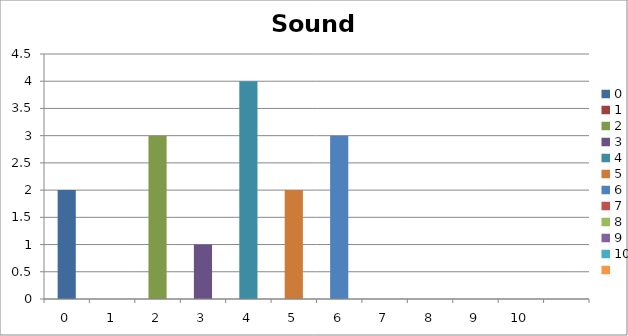
| Category | Sound Around |
|---|---|
| 0.0 | 2 |
| 1.0 | 0 |
| 2.0 | 3 |
| 3.0 | 1 |
| 4.0 | 4 |
| 5.0 | 2 |
| 6.0 | 3 |
| 7.0 | 0 |
| 8.0 | 0 |
| 9.0 | 0 |
| 10.0 | 0 |